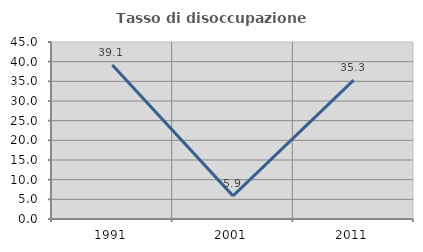
| Category | Tasso di disoccupazione giovanile  |
|---|---|
| 1991.0 | 39.13 |
| 2001.0 | 5.882 |
| 2011.0 | 35.294 |